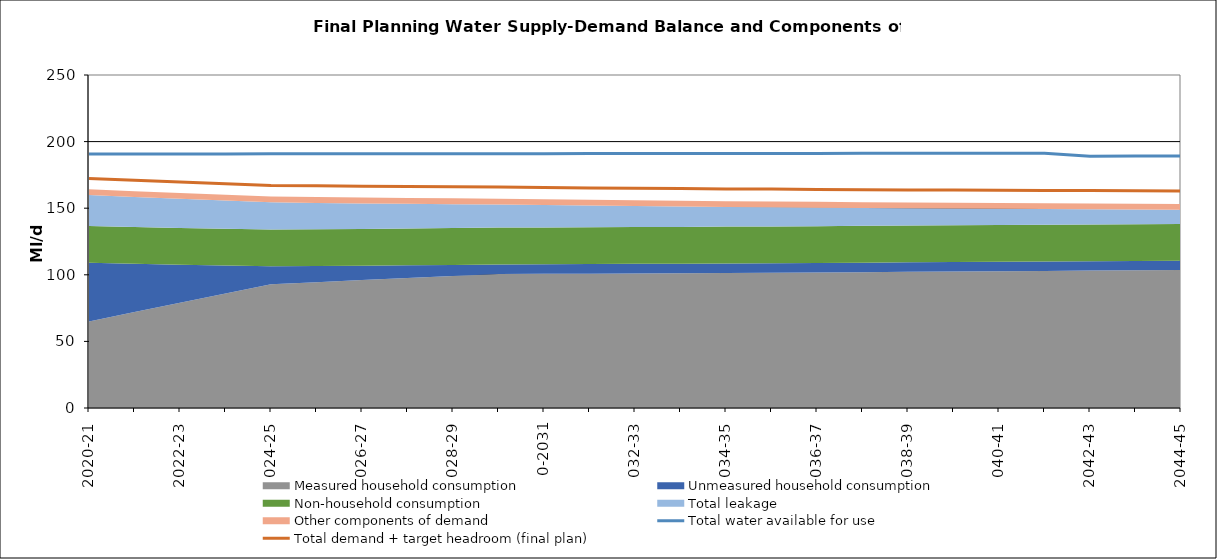
| Category | Total water available for use | Total demand + target headroom (final plan) |
|---|---|---|
| 0 | 190.669 | 172.33 |
| 1 | 190.699 | 170.98 |
| 2 | 190.729 | 169.588 |
| 3 | 190.759 | 168.356 |
| 4 | 190.789 | 167.061 |
| 5 | 190.819 | 166.799 |
| 6 | 190.849 | 166.432 |
| 7 | 190.879 | 166.205 |
| 8 | 190.909 | 166.079 |
| 9 | 190.939 | 165.841 |
| 10 | 190.969 | 165.559 |
| 11 | 190.999 | 165.184 |
| 12 | 191.029 | 164.93 |
| 13 | 191.059 | 164.736 |
| 14 | 191.089 | 164.34 |
| 15 | 191.119 | 164.336 |
| 16 | 191.149 | 164.124 |
| 17 | 191.179 | 163.933 |
| 18 | 191.209 | 163.751 |
| 19 | 191.239 | 163.596 |
| 20 | 191.269 | 163.483 |
| 21 | 191.299 | 163.359 |
| 22 | 189.079 | 163.237 |
| 23 | 189.109 | 163.104 |
| 24 | 189.149 | 162.962 |